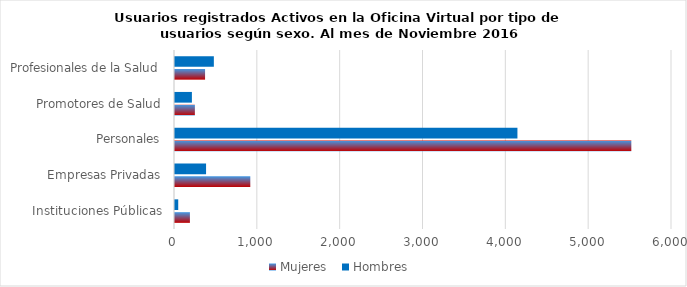
| Category | Mujeres | Hombres |
|---|---|---|
| Instituciones Públicas | 180 | 39 |
| Empresas Privadas | 909 | 375 |
| Personales | 5509 | 4134 |
| Promotores de Salud | 240 | 204 |
| Profesionales de la Salud | 363 | 469 |